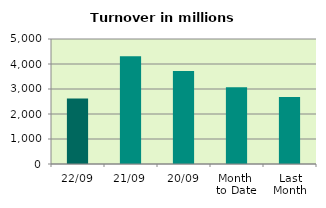
| Category | Series 0 |
|---|---|
| 22/09 | 2619.699 |
| 21/09 | 4308.196 |
| 20/09 | 3721.05 |
| Month 
to Date | 3068.761 |
| Last
Month | 2681.097 |